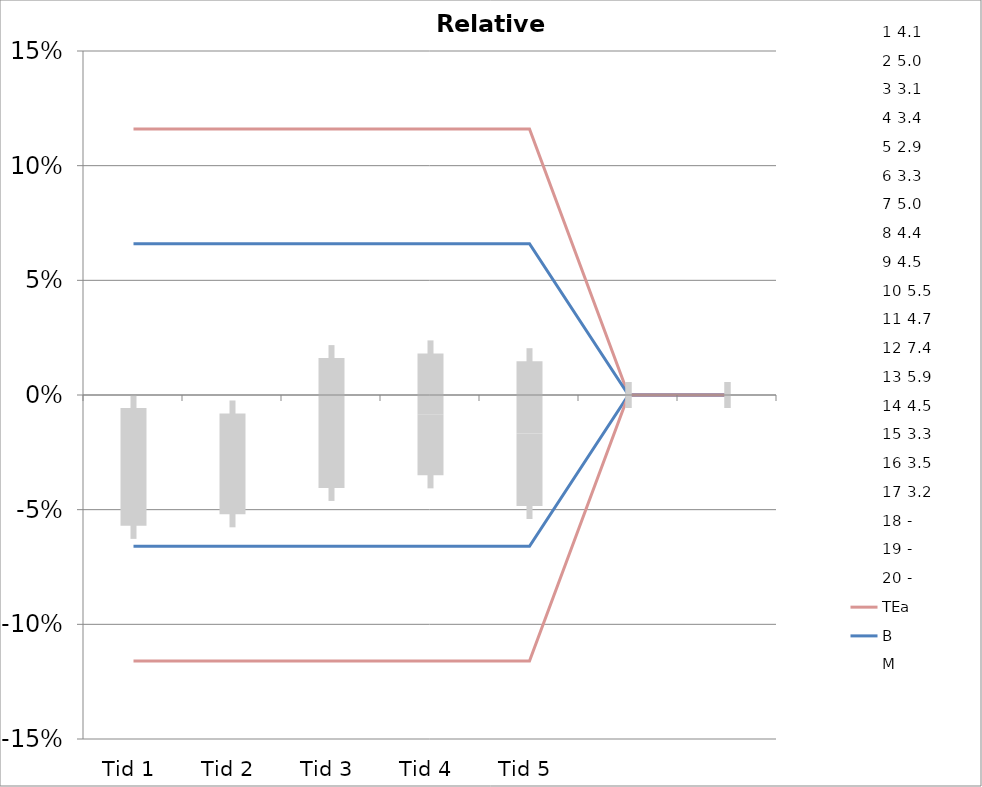
| Category | 1 | 2 | 3 | 4 | 5 | 6 | 7 | 8 | 9 | 10 | 11 | 12 | 13 | 14 | 15 | 16 | 17 | 18 | 19 | 20 | TEa | B | -B | -TEa | M |
|---|---|---|---|---|---|---|---|---|---|---|---|---|---|---|---|---|---|---|---|---|---|---|---|---|---|
| Tid 1 | -0.071 | -0.042 | -0.103 | 0.032 | 0 | 0 | -0.016 | -0.11 | -0.073 | -0.058 | -0.038 | -0.045 | -0.059 | 0.007 | 0.049 | -0.017 | 0.041 | 0 | 0 | 0 | 0.116 | 0.066 | -0.066 | -0.116 | -0.031 |
| Tid 2 | -0.046 | -0.066 | -0.074 | 0.047 | -0.007 | -0.076 | -0.03 | -0.075 | -0.013 | 0.011 | -0.006 | 0.005 | -0.061 | -0.029 | 0 | 0 | 0 | 0 | 0 | 0 | 0.116 | 0.066 | -0.066 | -0.116 | -0.03 |
| Tid 3 | -0.08 | -0.084 | -0.055 | 0.003 | 0.01 | 0.003 | 0.004 | -0.009 | 0.033 | -0.027 | -0.013 | 0.003 | -0.062 | 0.103 | 0 | 0 | 0 | 0 | 0 | 0 | 0.116 | 0.066 | -0.066 | -0.116 | -0.012 |
| Tid 4 | -0.054 | -0.036 | -0.077 | 0.035 | 0.072 | -0.024 | 0.014 | -0.018 | -0.029 | 0.027 | -0.006 | -0.02 | -0.067 | 0.065 | 0 | 0 | 0 | 0 | 0 | 0 | 0.116 | 0.066 | -0.066 | -0.116 | -0.008 |
| Tid 5 | 0 | 0 | -0.032 | 0.082 | -0.007 | -0.061 | 0 | -0.103 | -0.057 | 0.016 | -0.04 | -0.034 | -0.012 | 0.045 | 0 | 0 | 0 | 0 | 0 | 0 | 0.116 | 0.066 | -0.066 | -0.116 | -0.017 |